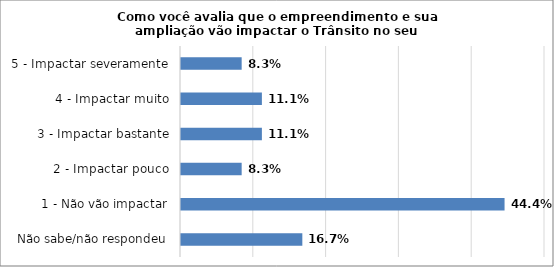
| Category | Series 0 |
|---|---|
| Não sabe/não respondeu | 0.167 |
| 1 - Não vão impactar | 0.444 |
| 2 - Impactar pouco | 0.083 |
| 3 - Impactar bastante | 0.111 |
| 4 - Impactar muito | 0.111 |
| 5 - Impactar severamente | 0.083 |